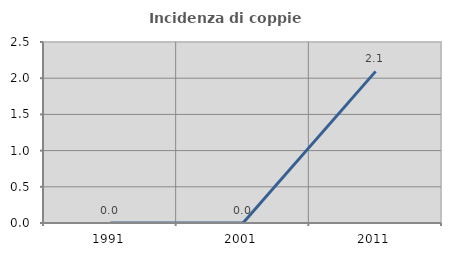
| Category | Incidenza di coppie miste |
|---|---|
| 1991.0 | 0 |
| 2001.0 | 0 |
| 2011.0 | 2.094 |